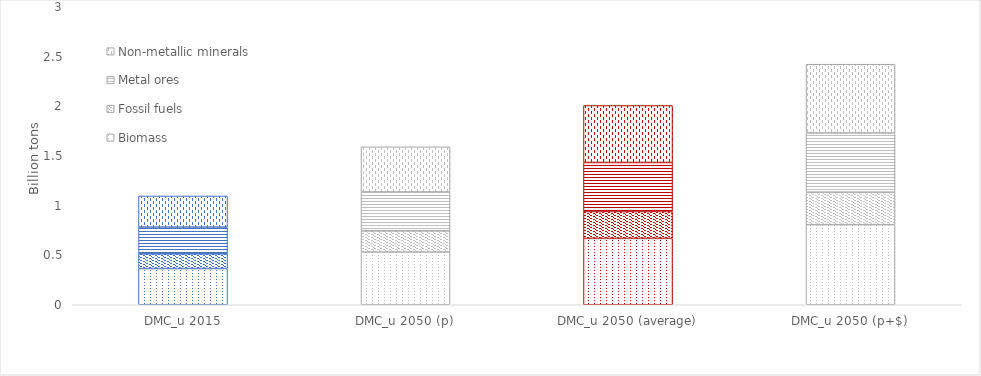
| Category | Biomass | Fossil fuels | Metal ores | Non-metallic minerals |
|---|---|---|---|---|
| DMC_u 2015 | 364.821 | 147.85 | 269.397 | 313.132 |
| DMC_u 2050 (p) | 529.657 | 214.652 | 391.118 | 454.613 |
| DMC_u 2050 (average) | 668.12 | 270.767 | 493.364 | 573.458 |
| DMC_u 2050 (p+$) | 806.584 | 326.882 | 595.611 | 692.304 |